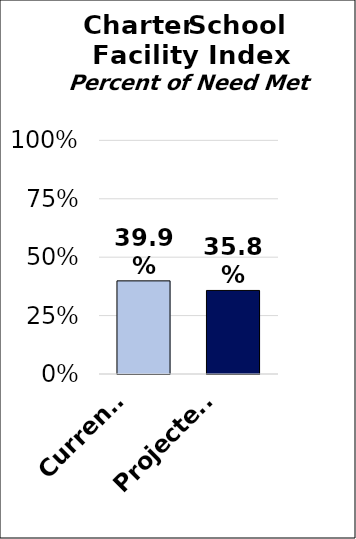
| Category | Charter School Facility Index |
|---|---|
|  Current
(FY 2020) | 0.399 |
| Projected
(FY 2025) | 0.358 |